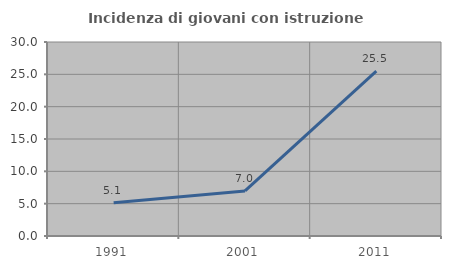
| Category | Incidenza di giovani con istruzione universitaria |
|---|---|
| 1991.0 | 5.128 |
| 2001.0 | 6.977 |
| 2011.0 | 25.49 |